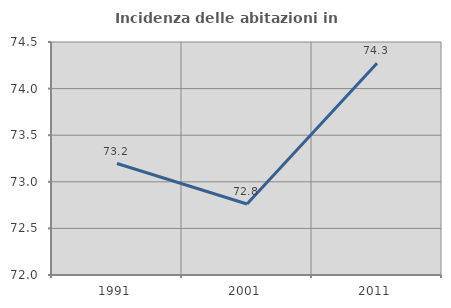
| Category | Incidenza delle abitazioni in proprietà  |
|---|---|
| 1991.0 | 73.196 |
| 2001.0 | 72.761 |
| 2011.0 | 74.271 |